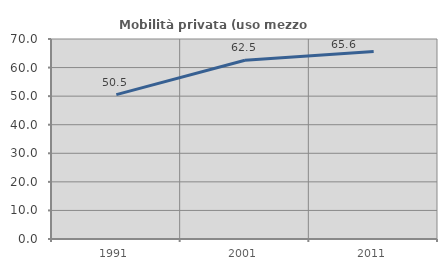
| Category | Mobilità privata (uso mezzo privato) |
|---|---|
| 1991.0 | 50.525 |
| 2001.0 | 62.542 |
| 2011.0 | 65.629 |